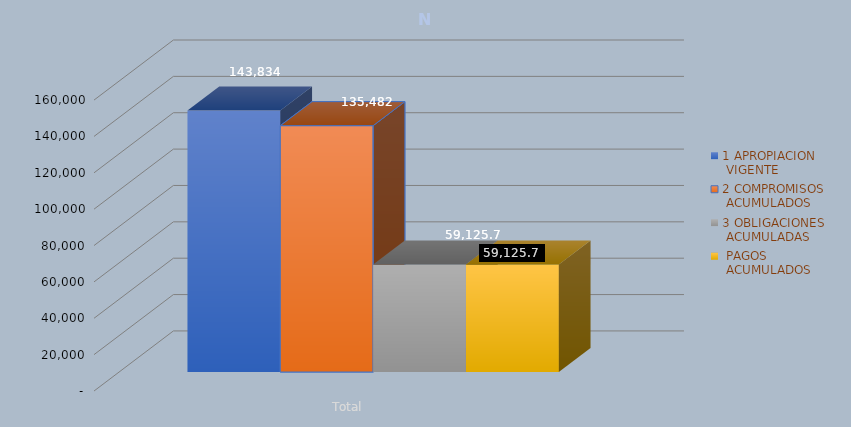
| Category | 1 APROPIACION
 VIGENTE | 2 COMPROMISOS
 ACUMULADOS | 3 OBLIGACIONES
 ACUMULADAS |  PAGOS
 ACUMULADOS |
|---|---|---|---|---|
| Total | 143833.689 | 135481.53 | 59125.669 | 59125.669 |